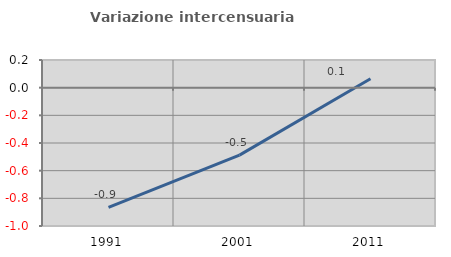
| Category | Variazione intercensuaria annua |
|---|---|
| 1991.0 | -0.866 |
| 2001.0 | -0.488 |
| 2011.0 | 0.064 |